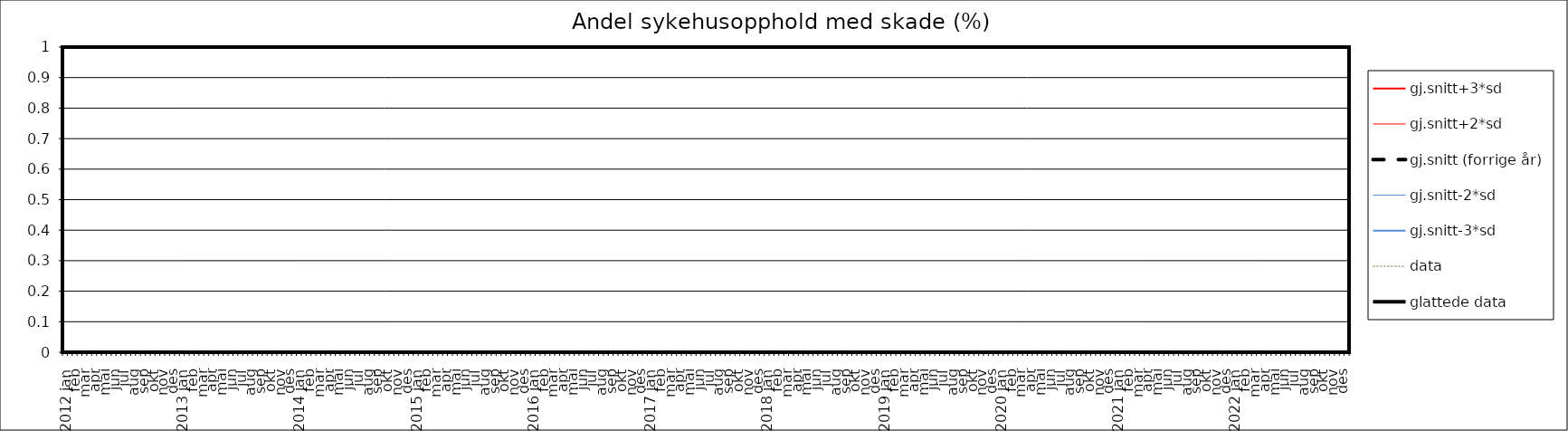
| Category | gj.snitt+3*sd | gj.snitt+2*sd | gj.snitt (forrige år) | gj.snitt-2*sd | gj.snitt-3*sd | data | glattede data |
|---|---|---|---|---|---|---|---|
| 2012 jan | 0 | 0 | 0 | 0 | 0 | 0 | 0 |
|  | 0 | 0 | 0 | 0 | 0 | 0 | 0 |
| feb | 0 | 0 | 0 | 0 | 0 | 0 | 0 |
|  | 0 | 0 | 0 | 0 | 0 | 0 | 0 |
| mar | 0 | 0 | 0 | 0 | 0 | 0 | 0 |
|  | 0 | 0 | 0 | 0 | 0 | 0 | 0 |
| apr | 0 | 0 | 0 | 0 | 0 | 0 | 0 |
|  | 0 | 0 | 0 | 0 | 0 | 0 | 0 |
| mai | 0 | 0 | 0 | 0 | 0 | 0 | 0 |
|  | 0 | 0 | 0 | 0 | 0 | 0 | 0 |
| jun | 0 | 0 | 0 | 0 | 0 | 0 | 0 |
|  | 0 | 0 | 0 | 0 | 0 | 0 | 0 |
| jul | 0 | 0 | 0 | 0 | 0 | 0 | 0 |
|  | 0 | 0 | 0 | 0 | 0 | 0 | 0 |
| aug | 0 | 0 | 0 | 0 | 0 | 0 | 0 |
|  | 0 | 0 | 0 | 0 | 0 | 0 | 0 |
| sep | 0 | 0 | 0 | 0 | 0 | 0 | 0 |
|  | 0 | 0 | 0 | 0 | 0 | 0 | 0 |
| okt | 0 | 0 | 0 | 0 | 0 | 0 | 0 |
|  | 0 | 0 | 0 | 0 | 0 | 0 | 0 |
| nov | 0 | 0 | 0 | 0 | 0 | 0 | 0 |
|  | 0 | 0 | 0 | 0 | 0 | 0 | 0 |
| des | 0 | 0 | 0 | 0 | 0 | 0 | 0 |
|  | 0 | 0 | 0 | 0 | 0 | 0 | 0 |
| 2013 jan | 0 | 0 | 0 | 0 | 0 | 0 | 0 |
|  | 0 | 0 | 0 | 0 | 0 | 0 | 0 |
| feb | 0 | 0 | 0 | 0 | 0 | 0 | 0 |
|  | 0 | 0 | 0 | 0 | 0 | 0 | 0 |
| mar | 0 | 0 | 0 | 0 | 0 | 0 | 0 |
|  | 0 | 0 | 0 | 0 | 0 | 0 | 0 |
| apr | 0 | 0 | 0 | 0 | 0 | 0 | 0 |
|  | 0 | 0 | 0 | 0 | 0 | 0 | 0 |
| mai | 0 | 0 | 0 | 0 | 0 | 0 | 0 |
|  | 0 | 0 | 0 | 0 | 0 | 0 | 0 |
| jun | 0 | 0 | 0 | 0 | 0 | 0 | 0 |
|  | 0 | 0 | 0 | 0 | 0 | 0 | 0 |
| jul | 0 | 0 | 0 | 0 | 0 | 0 | 0 |
|  | 0 | 0 | 0 | 0 | 0 | 0 | 0 |
| aug | 0 | 0 | 0 | 0 | 0 | 0 | 0 |
|  | 0 | 0 | 0 | 0 | 0 | 0 | 0 |
| sep | 0 | 0 | 0 | 0 | 0 | 0 | 0 |
|  | 0 | 0 | 0 | 0 | 0 | 0 | 0 |
| okt | 0 | 0 | 0 | 0 | 0 | 0 | 0 |
|  | 0 | 0 | 0 | 0 | 0 | 0 | 0 |
| nov | 0 | 0 | 0 | 0 | 0 | 0 | 0 |
|  | 0 | 0 | 0 | 0 | 0 | 0 | 0 |
| des | 0 | 0 | 0 | 0 | 0 | 0 | 0 |
|  | 0 | 0 | 0 | 0 | 0 | 0 | 0 |
| 2014 jan | 0 | 0 | 0 | 0 | 0 | 0 | 0 |
|  | 0 | 0 | 0 | 0 | 0 | 0 | 0 |
| feb | 0 | 0 | 0 | 0 | 0 | 0 | 0 |
|  | 0 | 0 | 0 | 0 | 0 | 0 | 0 |
| mar | 0 | 0 | 0 | 0 | 0 | 0 | 0 |
|  | 0 | 0 | 0 | 0 | 0 | 0 | 0 |
| apr | 0 | 0 | 0 | 0 | 0 | 0 | 0 |
|  | 0 | 0 | 0 | 0 | 0 | 0 | 0 |
| mai | 0 | 0 | 0 | 0 | 0 | 0 | 0 |
|  | 0 | 0 | 0 | 0 | 0 | 0 | 0 |
| jun | 0 | 0 | 0 | 0 | 0 | 0 | 0 |
|  | 0 | 0 | 0 | 0 | 0 | 0 | 0 |
| jul | 0 | 0 | 0 | 0 | 0 | 0 | 0 |
|  | 0 | 0 | 0 | 0 | 0 | 0 | 0 |
| aug | 0 | 0 | 0 | 0 | 0 | 0 | 0 |
|  | 0 | 0 | 0 | 0 | 0 | 0 | 0 |
| sep | 0 | 0 | 0 | 0 | 0 | 0 | 0 |
|  | 0 | 0 | 0 | 0 | 0 | 0 | 0 |
| okt | 0 | 0 | 0 | 0 | 0 | 0 | 0 |
|  | 0 | 0 | 0 | 0 | 0 | 0 | 0 |
| nov | 0 | 0 | 0 | 0 | 0 | 0 | 0 |
|  | 0 | 0 | 0 | 0 | 0 | 0 | 0 |
| des | 0 | 0 | 0 | 0 | 0 | 0 | 0 |
|  | 0 | 0 | 0 | 0 | 0 | 0 | 0 |
| 2015 jan | 0 | 0 | 0 | 0 | 0 | 0 | 0 |
|  | 0 | 0 | 0 | 0 | 0 | 0 | 0 |
| feb | 0 | 0 | 0 | 0 | 0 | 0 | 0 |
|  | 0 | 0 | 0 | 0 | 0 | 0 | 0 |
| mar | 0 | 0 | 0 | 0 | 0 | 0 | 0 |
|  | 0 | 0 | 0 | 0 | 0 | 0 | 0 |
| apr | 0 | 0 | 0 | 0 | 0 | 0 | 0 |
|  | 0 | 0 | 0 | 0 | 0 | 0 | 0 |
| mai | 0 | 0 | 0 | 0 | 0 | 0 | 0 |
|  | 0 | 0 | 0 | 0 | 0 | 0 | 0 |
| jun | 0 | 0 | 0 | 0 | 0 | 0 | 0 |
|  | 0 | 0 | 0 | 0 | 0 | 0 | 0 |
| jul | 0 | 0 | 0 | 0 | 0 | 0 | 0 |
|  | 0 | 0 | 0 | 0 | 0 | 0 | 0 |
| aug | 0 | 0 | 0 | 0 | 0 | 0 | 0 |
|  | 0 | 0 | 0 | 0 | 0 | 0 | 0 |
| sep | 0 | 0 | 0 | 0 | 0 | 0 | 0 |
|  | 0 | 0 | 0 | 0 | 0 | 0 | 0 |
| okt | 0 | 0 | 0 | 0 | 0 | 0 | 0 |
|  | 0 | 0 | 0 | 0 | 0 | 0 | 0 |
| nov | 0 | 0 | 0 | 0 | 0 | 0 | 0 |
|  | 0 | 0 | 0 | 0 | 0 | 0 | 0 |
| des | 0 | 0 | 0 | 0 | 0 | 0 | 0 |
|  | 0 | 0 | 0 | 0 | 0 | 0 | 0 |
| 2016 jan | 0 | 0 | 0 | 0 | 0 | 0 | 0 |
|  | 0 | 0 | 0 | 0 | 0 | 0 | 0 |
| feb | 0 | 0 | 0 | 0 | 0 | 0 | 0 |
|  | 0 | 0 | 0 | 0 | 0 | 0 | 0 |
| mar | 0 | 0 | 0 | 0 | 0 | 0 | 0 |
|  | 0 | 0 | 0 | 0 | 0 | 0 | 0 |
| apr | 0 | 0 | 0 | 0 | 0 | 0 | 0 |
|  | 0 | 0 | 0 | 0 | 0 | 0 | 0 |
| mai | 0 | 0 | 0 | 0 | 0 | 0 | 0 |
|  | 0 | 0 | 0 | 0 | 0 | 0 | 0 |
| jun | 0 | 0 | 0 | 0 | 0 | 0 | 0 |
|  | 0 | 0 | 0 | 0 | 0 | 0 | 0 |
| jul | 0 | 0 | 0 | 0 | 0 | 0 | 0 |
|  | 0 | 0 | 0 | 0 | 0 | 0 | 0 |
| aug | 0 | 0 | 0 | 0 | 0 | 0 | 0 |
|  | 0 | 0 | 0 | 0 | 0 | 0 | 0 |
| sep | 0 | 0 | 0 | 0 | 0 | 0 | 0 |
|  | 0 | 0 | 0 | 0 | 0 | 0 | 0 |
| okt | 0 | 0 | 0 | 0 | 0 | 0 | 0 |
|  | 0 | 0 | 0 | 0 | 0 | 0 | 0 |
| nov | 0 | 0 | 0 | 0 | 0 | 0 | 0 |
|  | 0 | 0 | 0 | 0 | 0 | 0 | 0 |
| des | 0 | 0 | 0 | 0 | 0 | 0 | 0 |
|  | 0 | 0 | 0 | 0 | 0 | 0 | 0 |
| 2017 jan | 0 | 0 | 0 | 0 | 0 | 0 | 0 |
|  | 0 | 0 | 0 | 0 | 0 | 0 | 0 |
| feb | 0 | 0 | 0 | 0 | 0 | 0 | 0 |
|  | 0 | 0 | 0 | 0 | 0 | 0 | 0 |
| mar | 0 | 0 | 0 | 0 | 0 | 0 | 0 |
|  | 0 | 0 | 0 | 0 | 0 | 0 | 0 |
| apr | 0 | 0 | 0 | 0 | 0 | 0 | 0 |
|  | 0 | 0 | 0 | 0 | 0 | 0 | 0 |
| mai | 0 | 0 | 0 | 0 | 0 | 0 | 0 |
|  | 0 | 0 | 0 | 0 | 0 | 0 | 0 |
| jun | 0 | 0 | 0 | 0 | 0 | 0 | 0 |
|  | 0 | 0 | 0 | 0 | 0 | 0 | 0 |
| jul | 0 | 0 | 0 | 0 | 0 | 0 | 0 |
|  | 0 | 0 | 0 | 0 | 0 | 0 | 0 |
| aug | 0 | 0 | 0 | 0 | 0 | 0 | 0 |
|  | 0 | 0 | 0 | 0 | 0 | 0 | 0 |
| sep | 0 | 0 | 0 | 0 | 0 | 0 | 0 |
|  | 0 | 0 | 0 | 0 | 0 | 0 | 0 |
| okt | 0 | 0 | 0 | 0 | 0 | 0 | 0 |
|  | 0 | 0 | 0 | 0 | 0 | 0 | 0 |
| nov | 0 | 0 | 0 | 0 | 0 | 0 | 0 |
|  | 0 | 0 | 0 | 0 | 0 | 0 | 0 |
| des | 0 | 0 | 0 | 0 | 0 | 0 | 0 |
|  | 0 | 0 | 0 | 0 | 0 | 0 | 0 |
| 2018 jan | 0 | 0 | 0 | 0 | 0 | 0 | 0 |
|  | 0 | 0 | 0 | 0 | 0 | 0 | 0 |
| feb | 0 | 0 | 0 | 0 | 0 | 0 | 0 |
|  | 0 | 0 | 0 | 0 | 0 | 0 | 0 |
| mar | 0 | 0 | 0 | 0 | 0 | 0 | 0 |
|  | 0 | 0 | 0 | 0 | 0 | 0 | 0 |
| apr | 0 | 0 | 0 | 0 | 0 | 0 | 0 |
|  | 0 | 0 | 0 | 0 | 0 | 0 | 0 |
| mai | 0 | 0 | 0 | 0 | 0 | 0 | 0 |
|  | 0 | 0 | 0 | 0 | 0 | 0 | 0 |
| jun | 0 | 0 | 0 | 0 | 0 | 0 | 0 |
|  | 0 | 0 | 0 | 0 | 0 | 0 | 0 |
| jul | 0 | 0 | 0 | 0 | 0 | 0 | 0 |
|  | 0 | 0 | 0 | 0 | 0 | 0 | 0 |
| aug | 0 | 0 | 0 | 0 | 0 | 0 | 0 |
|  | 0 | 0 | 0 | 0 | 0 | 0 | 0 |
| sep | 0 | 0 | 0 | 0 | 0 | 0 | 0 |
|  | 0 | 0 | 0 | 0 | 0 | 0 | 0 |
| okt | 0 | 0 | 0 | 0 | 0 | 0 | 0 |
|  | 0 | 0 | 0 | 0 | 0 | 0 | 0 |
| nov | 0 | 0 | 0 | 0 | 0 | 0 | 0 |
|  | 0 | 0 | 0 | 0 | 0 | 0 | 0 |
| des | 0 | 0 | 0 | 0 | 0 | 0 | 0 |
|  | 0 | 0 | 0 | 0 | 0 | 0 | 0 |
| 2019 jan | 0 | 0 | 0 | 0 | 0 | 0 | 0 |
|  | 0 | 0 | 0 | 0 | 0 | 0 | 0 |
| feb | 0 | 0 | 0 | 0 | 0 | 0 | 0 |
|  | 0 | 0 | 0 | 0 | 0 | 0 | 0 |
| mar | 0 | 0 | 0 | 0 | 0 | 0 | 0 |
|  | 0 | 0 | 0 | 0 | 0 | 0 | 0 |
| apr | 0 | 0 | 0 | 0 | 0 | 0 | 0 |
|  | 0 | 0 | 0 | 0 | 0 | 0 | 0 |
| mai | 0 | 0 | 0 | 0 | 0 | 0 | 0 |
|  | 0 | 0 | 0 | 0 | 0 | 0 | 0 |
| jun | 0 | 0 | 0 | 0 | 0 | 0 | 0 |
|  | 0 | 0 | 0 | 0 | 0 | 0 | 0 |
| jul | 0 | 0 | 0 | 0 | 0 | 0 | 0 |
|  | 0 | 0 | 0 | 0 | 0 | 0 | 0 |
| aug | 0 | 0 | 0 | 0 | 0 | 0 | 0 |
|  | 0 | 0 | 0 | 0 | 0 | 0 | 0 |
| sep | 0 | 0 | 0 | 0 | 0 | 0 | 0 |
|  | 0 | 0 | 0 | 0 | 0 | 0 | 0 |
| okt | 0 | 0 | 0 | 0 | 0 | 0 | 0 |
|  | 0 | 0 | 0 | 0 | 0 | 0 | 0 |
| nov | 0 | 0 | 0 | 0 | 0 | 0 | 0 |
|  | 0 | 0 | 0 | 0 | 0 | 0 | 0 |
| des | 0 | 0 | 0 | 0 | 0 | 0 | 0 |
|  | 0 | 0 | 0 | 0 | 0 | 0 | 0 |
| 2020 jan | 0 | 0 | 0 | 0 | 0 | 0 | 0 |
|  | 0 | 0 | 0 | 0 | 0 | 0 | 0 |
| feb | 0 | 0 | 0 | 0 | 0 | 0 | 0 |
|  | 0 | 0 | 0 | 0 | 0 | 0 | 0 |
| mar | 0 | 0 | 0 | 0 | 0 | 0 | 0 |
|  | 0 | 0 | 0 | 0 | 0 | 0 | 0 |
| apr | 0 | 0 | 0 | 0 | 0 | 0 | 0 |
|  | 0 | 0 | 0 | 0 | 0 | 0 | 0 |
| mai | 0 | 0 | 0 | 0 | 0 | 0 | 0 |
|  | 0 | 0 | 0 | 0 | 0 | 0 | 0 |
| jun | 0 | 0 | 0 | 0 | 0 | 0 | 0 |
|  | 0 | 0 | 0 | 0 | 0 | 0 | 0 |
| jul | 0 | 0 | 0 | 0 | 0 | 0 | 0 |
|  | 0 | 0 | 0 | 0 | 0 | 0 | 0 |
| aug | 0 | 0 | 0 | 0 | 0 | 0 | 0 |
|  | 0 | 0 | 0 | 0 | 0 | 0 | 0 |
| sep | 0 | 0 | 0 | 0 | 0 | 0 | 0 |
|  | 0 | 0 | 0 | 0 | 0 | 0 | 0 |
| okt | 0 | 0 | 0 | 0 | 0 | 0 | 0 |
|  | 0 | 0 | 0 | 0 | 0 | 0 | 0 |
| nov | 0 | 0 | 0 | 0 | 0 | 0 | 0 |
|  | 0 | 0 | 0 | 0 | 0 | 0 | 0 |
| des | 0 | 0 | 0 | 0 | 0 | 0 | 0 |
|  | 0 | 0 | 0 | 0 | 0 | 0 | 0 |
| 2021 jan | 0 | 0 | 0 | 0 | 0 | 0 | 0 |
|  | 0 | 0 | 0 | 0 | 0 | 0 | 0 |
| feb | 0 | 0 | 0 | 0 | 0 | 0 | 0 |
|  | 0 | 0 | 0 | 0 | 0 | 0 | 0 |
| mar | 0 | 0 | 0 | 0 | 0 | 0 | 0 |
|  | 0 | 0 | 0 | 0 | 0 | 0 | 0 |
| apr | 0 | 0 | 0 | 0 | 0 | 0 | 0 |
|  | 0 | 0 | 0 | 0 | 0 | 0 | 0 |
| mai | 0 | 0 | 0 | 0 | 0 | 0 | 0 |
|  | 0 | 0 | 0 | 0 | 0 | 0 | 0 |
| jun | 0 | 0 | 0 | 0 | 0 | 0 | 0 |
|  | 0 | 0 | 0 | 0 | 0 | 0 | 0 |
| jul | 0 | 0 | 0 | 0 | 0 | 0 | 0 |
|  | 0 | 0 | 0 | 0 | 0 | 0 | 0 |
| aug | 0 | 0 | 0 | 0 | 0 | 0 | 0 |
|  | 0 | 0 | 0 | 0 | 0 | 0 | 0 |
| sep | 0 | 0 | 0 | 0 | 0 | 0 | 0 |
|  | 0 | 0 | 0 | 0 | 0 | 0 | 0 |
| okt | 0 | 0 | 0 | 0 | 0 | 0 | 0 |
|  | 0 | 0 | 0 | 0 | 0 | 0 | 0 |
| nov | 0 | 0 | 0 | 0 | 0 | 0 | 0 |
|  | 0 | 0 | 0 | 0 | 0 | 0 | 0 |
| des | 0 | 0 | 0 | 0 | 0 | 0 | 0 |
|  | 0 | 0 | 0 | 0 | 0 | 0 | 0 |
| 2022 jan | 0 | 0 | 0 | 0 | 0 | 0 | 0 |
|  | 0 | 0 | 0 | 0 | 0 | 0 | 0 |
| feb | 0 | 0 | 0 | 0 | 0 | 0 | 0 |
|  | 0 | 0 | 0 | 0 | 0 | 0 | 0 |
| mar | 0 | 0 | 0 | 0 | 0 | 0 | 0 |
|  | 0 | 0 | 0 | 0 | 0 | 0 | 0 |
| apr | 0 | 0 | 0 | 0 | 0 | 0 | 0 |
|  | 0 | 0 | 0 | 0 | 0 | 0 | 0 |
| mai | 0 | 0 | 0 | 0 | 0 | 0 | 0 |
|  | 0 | 0 | 0 | 0 | 0 | 0 | 0 |
| jun | 0 | 0 | 0 | 0 | 0 | 0 | 0 |
|  | 0 | 0 | 0 | 0 | 0 | 0 | 0 |
| jul | 0 | 0 | 0 | 0 | 0 | 0 | 0 |
|  | 0 | 0 | 0 | 0 | 0 | 0 | 0 |
| aug | 0 | 0 | 0 | 0 | 0 | 0 | 0 |
|  | 0 | 0 | 0 | 0 | 0 | 0 | 0 |
| sep | 0 | 0 | 0 | 0 | 0 | 0 | 0 |
|  | 0 | 0 | 0 | 0 | 0 | 0 | 0 |
| okt | 0 | 0 | 0 | 0 | 0 | 0 | 0 |
|  | 0 | 0 | 0 | 0 | 0 | 0 | 0 |
| nov | 0 | 0 | 0 | 0 | 0 | 0 | 0 |
|  | 0 | 0 | 0 | 0 | 0 | 0 | 0 |
| des | 0 | 0 | 0 | 0 | 0 | 0 | 0 |